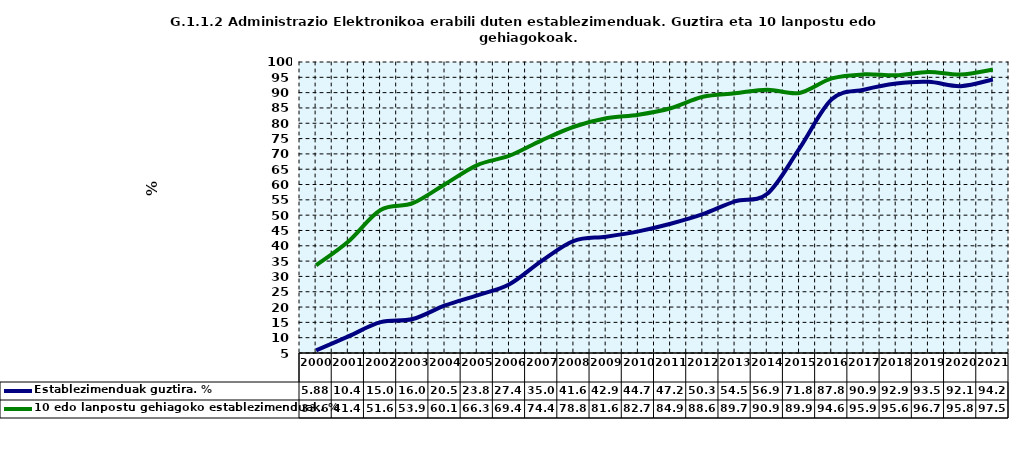
| Category | Establezimenduak guztira. % | 10 edo lanpostu gehiagoko establezimenduak. % |
|---|---|---|
| 2000.0 | 5.883 | 33.627 |
| 2001.0 | 10.421 | 41.411 |
| 2002.0 | 15.068 | 51.694 |
| 2003.0 | 16.098 | 53.904 |
| 2004.0 | 20.515 | 60.107 |
| 2005.0 | 23.837 | 66.349 |
| 2006.0 | 27.46 | 69.402 |
| 2007.0 | 35.078 | 74.42 |
| 2008.0 | 41.612 | 78.862 |
| 2009.0 | 42.972 | 81.627 |
| 2010.0 | 44.715 | 82.794 |
| 2011.0 | 47.2 | 84.9 |
| 2012.0 | 50.321 | 88.639 |
| 2013.0 | 54.524 | 89.774 |
| 2014.0 | 56.986 | 90.972 |
| 2015.0 | 71.8 | 89.9 |
| 2016.0 | 87.813 | 94.63 |
| 2017.0 | 90.959 | 95.964 |
| 2018.0 | 92.961 | 95.655 |
| 2019.0 | 93.517 | 96.71 |
| 2020.0 | 92.114 | 95.9 |
| 2021.0 | 94.294 | 97.529 |